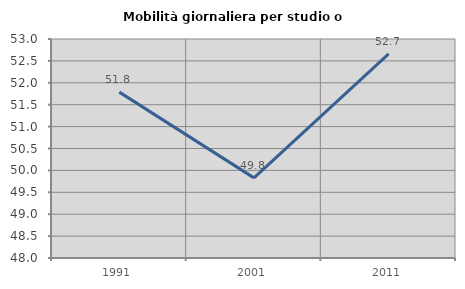
| Category | Mobilità giornaliera per studio o lavoro |
|---|---|
| 1991.0 | 51.787 |
| 2001.0 | 49.829 |
| 2011.0 | 52.659 |